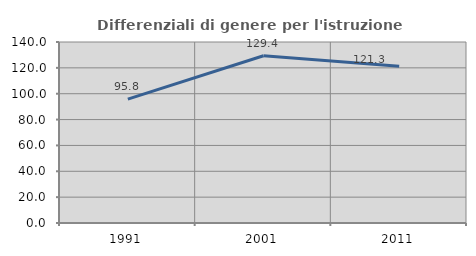
| Category | Differenziali di genere per l'istruzione superiore |
|---|---|
| 1991.0 | 95.823 |
| 2001.0 | 129.378 |
| 2011.0 | 121.266 |